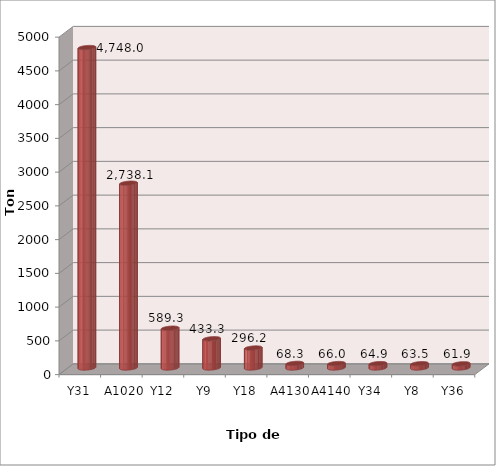
| Category | Series 0 |
|---|---|
| Y31 | 4747.969 |
| A1020 | 2738.067 |
| Y12 | 589.279 |
| Y9 | 433.29 |
| Y18 | 296.234 |
| A4130 | 68.332 |
| A4140 | 66.018 |
| Y34 | 64.858 |
| Y8 | 63.544 |
| Y36 | 61.88 |